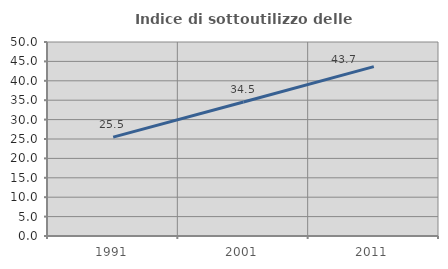
| Category | Indice di sottoutilizzo delle abitazioni  |
|---|---|
| 1991.0 | 25.481 |
| 2001.0 | 34.523 |
| 2011.0 | 43.658 |